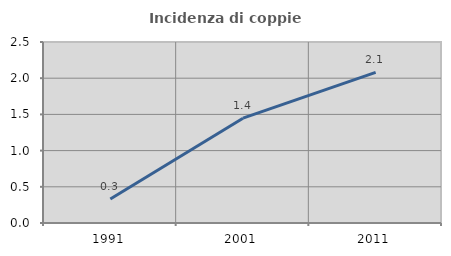
| Category | Incidenza di coppie miste |
|---|---|
| 1991.0 | 0.332 |
| 2001.0 | 1.448 |
| 2011.0 | 2.08 |